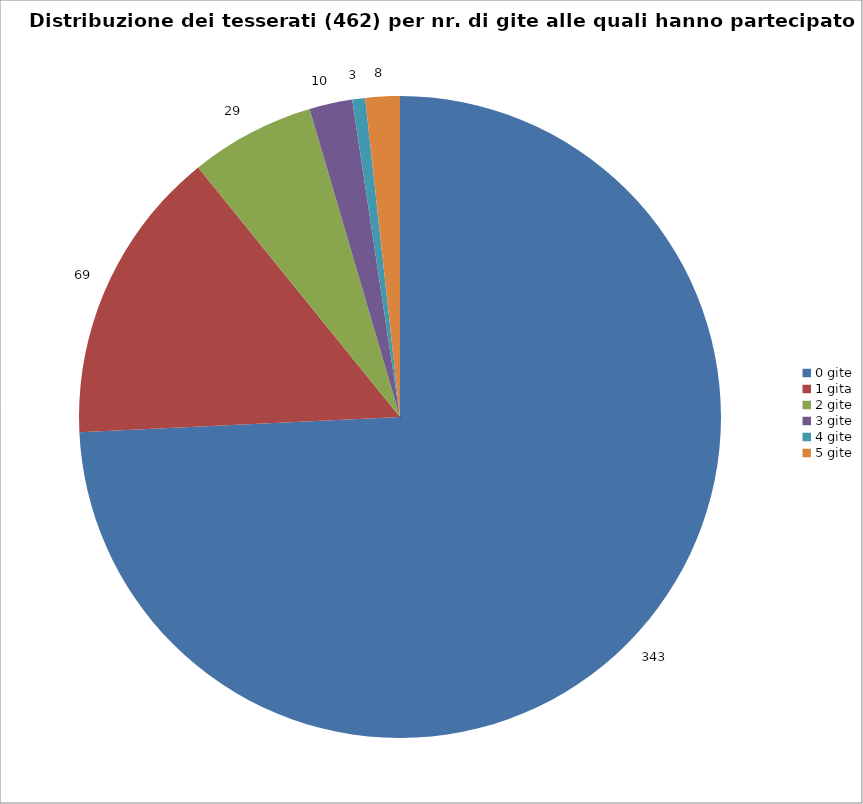
| Category | Nr. Tesserati |
|---|---|
| 0 gite | 343 |
| 1 gita | 69 |
| 2 gite | 29 |
| 3 gite | 10 |
| 4 gite | 3 |
| 5 gite | 8 |